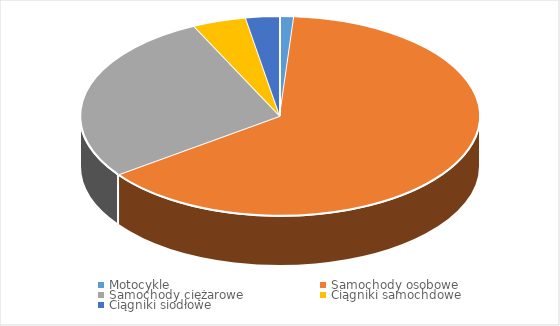
| Category | Series 0 |
|---|---|
| Motocykle | 0.011 |
| Samochody osobowe | 0.639 |
| Samochody ciężarowe | 0.279 |
| Ciągniki samochdowe | 0.043 |
| Ciągniki siodłowe | 0.027 |